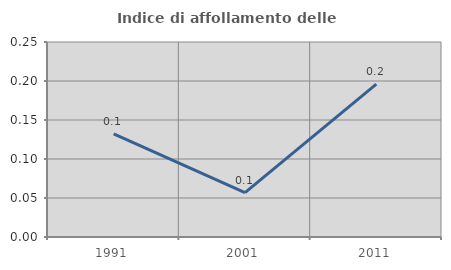
| Category | Indice di affollamento delle abitazioni  |
|---|---|
| 1991.0 | 0.132 |
| 2001.0 | 0.057 |
| 2011.0 | 0.196 |